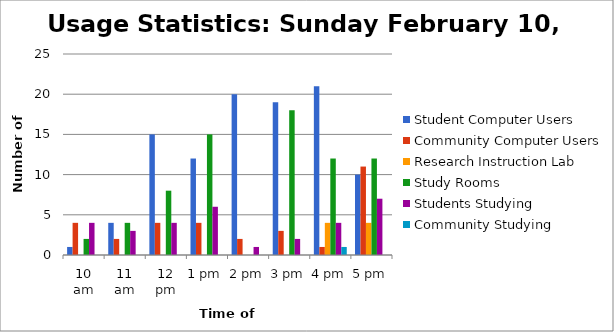
| Category | Student Computer Users | Community Computer Users | Research Instruction Lab | Study Rooms | Students Studying | Community Studying |
|---|---|---|---|---|---|---|
| 10 am | 1 | 4 | 0 | 2 | 4 | 0 |
| 11 am | 4 | 2 | 0 | 4 | 3 | 0 |
| 12 pm | 15 | 4 | 0 | 8 | 4 | 0 |
| 1 pm | 12 | 4 | 0 | 15 | 6 | 0 |
| 2 pm | 20 | 2 | 0 | 0 | 1 | 0 |
| 3 pm | 19 | 3 | 0 | 18 | 2 | 0 |
| 4 pm | 21 | 1 | 4 | 12 | 4 | 1 |
| 5 pm | 10 | 11 | 4 | 12 | 7 | 0 |